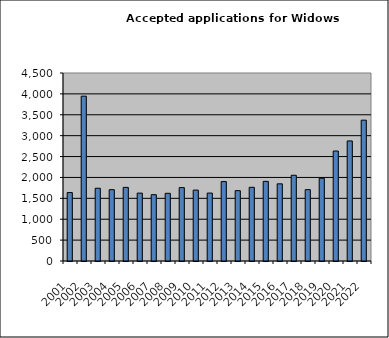
| Category | Series 1 |
|---|---|
| 2001.0 | 1638 |
| 2002.0 | 3945 |
| 2003.0 | 1741 |
| 2004.0 | 1707 |
| 2005.0 | 1762 |
| 2006.0 | 1625 |
| 2007.0 | 1587 |
| 2008.0 | 1620 |
| 2009.0 | 1757 |
| 2010.0 | 1697 |
| 2011.0 | 1626 |
| 2012.0 | 1901 |
| 2013.0 | 1684 |
| 2014.0 | 1764 |
| 2015.0 | 1906 |
| 2016.0 | 1847 |
| 2017.0 | 2052 |
| 2018.0 | 1708 |
| 2019.0 | 1981 |
| 2020.0 | 2632 |
| 2021.0 | 2874 |
| 2022.0 | 3371 |